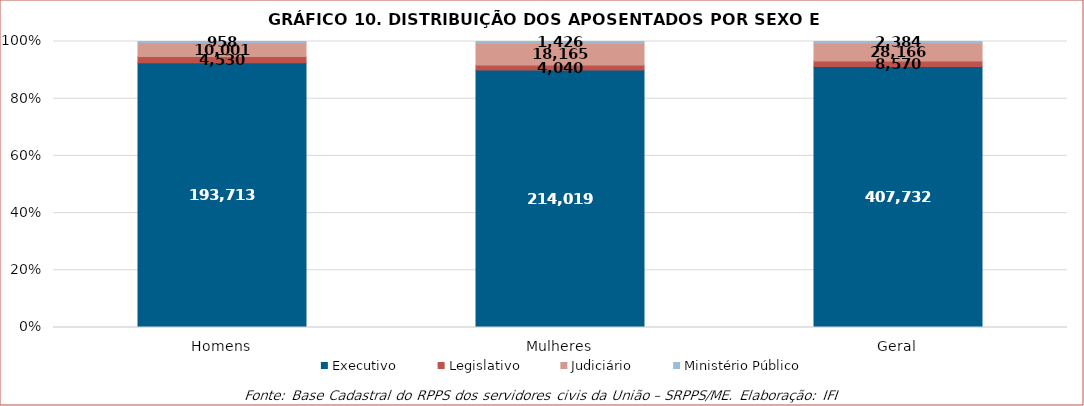
| Category | Executivo | Legislativo | Judiciário | Ministério Público |
|---|---|---|---|---|
| Homens | 193713 | 4530 | 10001 | 958 |
| Mulheres | 214019 | 4040 | 18165 | 1426 |
| Geral | 407732 | 8570 | 28166 | 2384 |